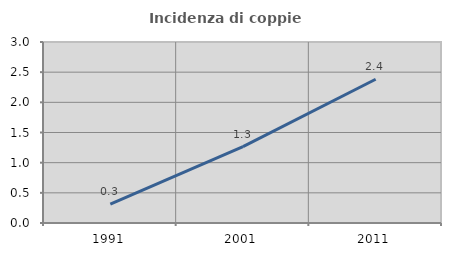
| Category | Incidenza di coppie miste |
|---|---|
| 1991.0 | 0.312 |
| 2001.0 | 1.266 |
| 2011.0 | 2.382 |